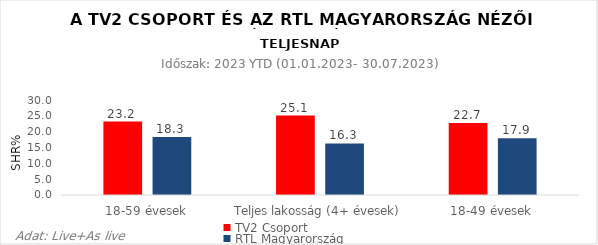
| Category | TV2 Csoport | RTL Magyarország |
|---|---|---|
| 18-59 évesek | 23.2 | 18.3 |
| Teljes lakosság (4+ évesek) | 25.1 | 16.3 |
| 18-49 évesek | 22.7 | 17.9 |